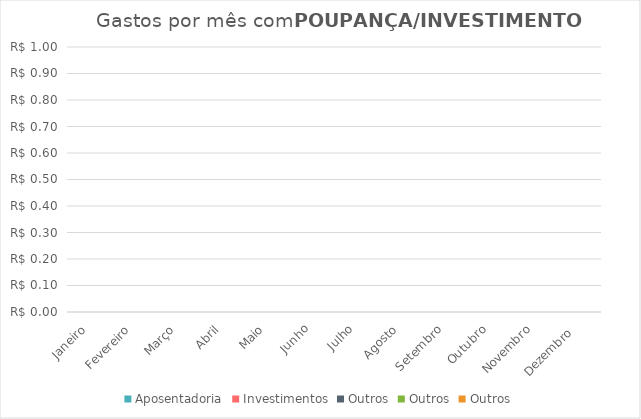
| Category | Aposentadoria | Investimentos | Outros |
|---|---|---|---|
| Janeiro | 0 | 0 | 0 |
| Fevereiro | 0 | 0 | 0 |
| Março | 0 | 0 | 0 |
| Abril | 0 | 0 | 0 |
| Maio | 0 | 0 | 0 |
| Junho | 0 | 0 | 0 |
| Julho | 0 | 0 | 0 |
| Agosto | 0 | 0 | 0 |
| Setembro | 0 | 0 | 0 |
| Outubro | 0 | 0 | 0 |
| Novembro | 0 | 0 | 0 |
| Dezembro  | 0 | 0 | 0 |